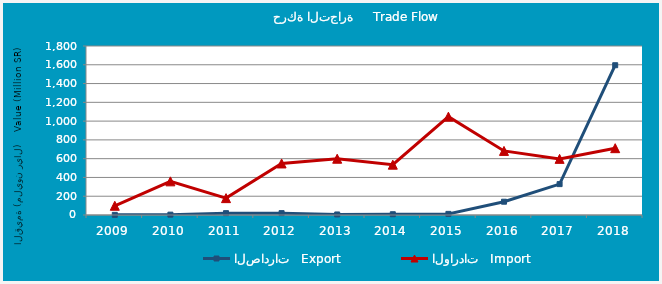
| Category | الصادرات   Export | الواردات   Import |
|---|---|---|
| 2009.0 | 1480936 | 98465546 |
| 2010.0 | 3808889 | 358437409 |
| 2011.0 | 19697625 | 179707054 |
| 2012.0 | 19927933 | 548947497 |
| 2013.0 | 5661119 | 599389730 |
| 2014.0 | 8205860 | 535974236 |
| 2015.0 | 11840111 | 1047430399 |
| 2016.0 | 141541051 | 682666803 |
| 2017.0 | 328930885 | 597921030 |
| 2018.0 | 1595298997 | 711643600 |